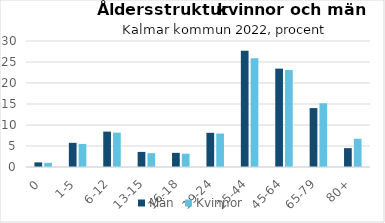
| Category | Män | Kvinnor |
|---|---|---|
| 0 | 1.098 | 1.002 |
| 1-5 | 5.755 | 5.487 |
| 6-12 | 8.427 | 8.189 |
| 13-15 | 3.596 | 3.295 |
| 16-18 | 3.368 | 3.167 |
| 19-24 | 8.143 | 7.96 |
| 25-44 | 27.678 | 25.897 |
| 45-64 | 23.419 | 23.106 |
| 65-79 | 14.023 | 15.174 |
| 80+ | 4.493 | 6.722 |